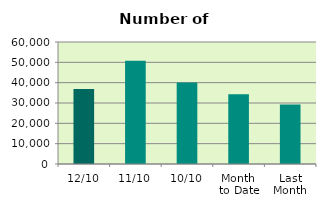
| Category | Series 0 |
|---|---|
| 12/10 | 36892 |
| 11/10 | 50778 |
| 10/10 | 40094 |
| Month 
to Date | 34348.6 |
| Last
Month | 29250.6 |